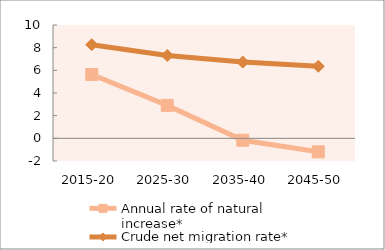
| Category | Annual rate of natural increase* | Crude net migration rate* |
|---|---|---|
| 2015-20 | 5.632 | 8.258 |
| 2025-30 | 2.908 | 7.309 |
| 2035-40 | -0.172 | 6.732 |
| 2045-50 | -1.19 | 6.355 |